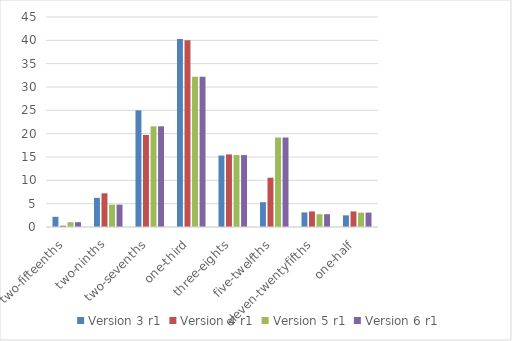
| Category | Version 3 r1 | Version 4 r1 | Version 5 r1 | Version 6 r1 |
|---|---|---|---|---|
| two-fifteenths | 2.188 | 0.278 | 1.027 | 1.027 |
| two-ninths | 6.25 | 7.222 | 4.795 | 4.795 |
| two-sevenths | 25 | 19.722 | 21.575 | 21.575 |
| one-third | 40.312 | 40 | 32.192 | 32.192 |
| three-eights | 15.312 | 15.556 | 15.411 | 15.411 |
| five-twelfths | 5.312 | 10.556 | 19.178 | 19.178 |
| eleven-twentyfifths | 3.125 | 3.333 | 2.74 | 2.74 |
| one-half | 2.5 | 3.333 | 3.082 | 3.082 |